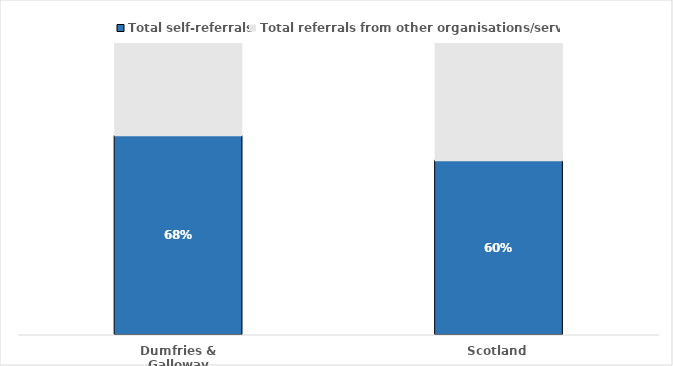
| Category | Total self-referrals | Total referrals from other organisations/services |
|---|---|---|
| Dumfries & Galloway | 0.684 | 0.316 |
| Scotland | 0.599 | 0.401 |